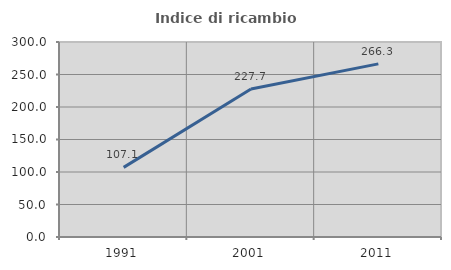
| Category | Indice di ricambio occupazionale  |
|---|---|
| 1991.0 | 107.074 |
| 2001.0 | 227.679 |
| 2011.0 | 266.304 |